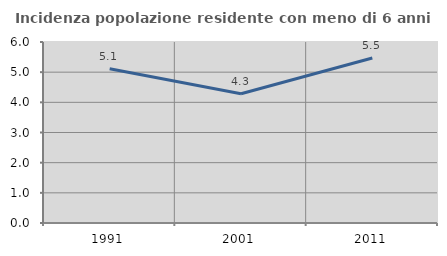
| Category | Incidenza popolazione residente con meno di 6 anni |
|---|---|
| 1991.0 | 5.111 |
| 2001.0 | 4.285 |
| 2011.0 | 5.47 |